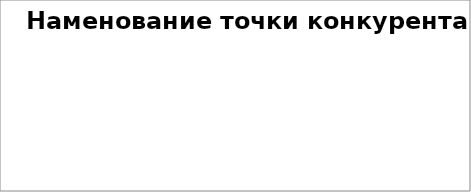
| Category | Наименование точки конкурента |
|---|---|
| 15-17 | 0 |
| 17-22 | 0 |
| 22-30 | 0 |
| 30-40 | 0 |
| 40-50 | 0 |
| 50 и более | 0 |